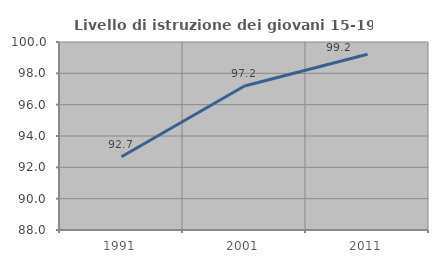
| Category | Livello di istruzione dei giovani 15-19 anni |
|---|---|
| 1991.0 | 92.679 |
| 2001.0 | 97.194 |
| 2011.0 | 99.215 |